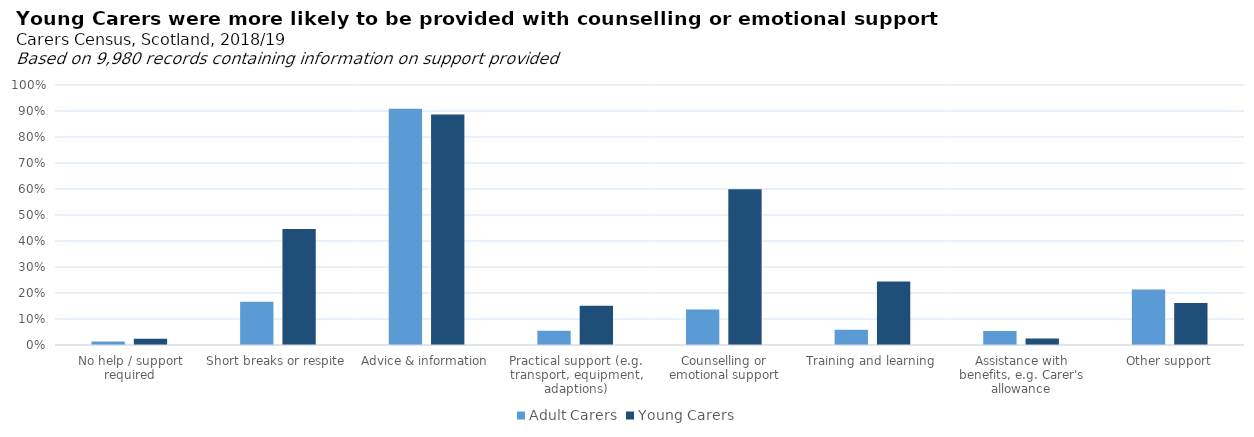
| Category | Adult Carers | Young Carers |
|---|---|---|
| No help / support required | 0.013 | 0.024 |
| Short breaks or respite | 0.166 | 0.446 |
| Advice & information | 0.909 | 0.887 |
| Practical support (e.g. transport, equipment, adaptions) | 0.055 | 0.151 |
| Counselling or emotional support | 0.137 | 0.599 |
| Training and learning | 0.059 | 0.244 |
| Assistance with benefits, e.g. Carer's allowance | 0.054 | 0.025 |
| Other support | 0.213 | 0.162 |